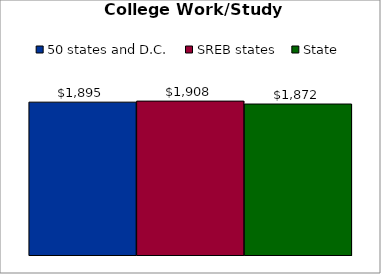
| Category | 50 states and D.C. | SREB states | State |
|---|---|---|---|
| 0 | 1894.893 | 1907.827 | 1871.705 |